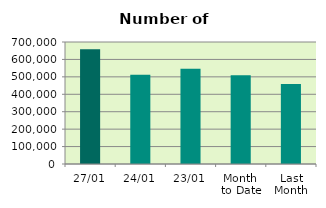
| Category | Series 0 |
|---|---|
| 27/01 | 658218 |
| 24/01 | 511538 |
| 23/01 | 547034 |
| Month 
to Date | 508626 |
| Last
Month | 458836.4 |